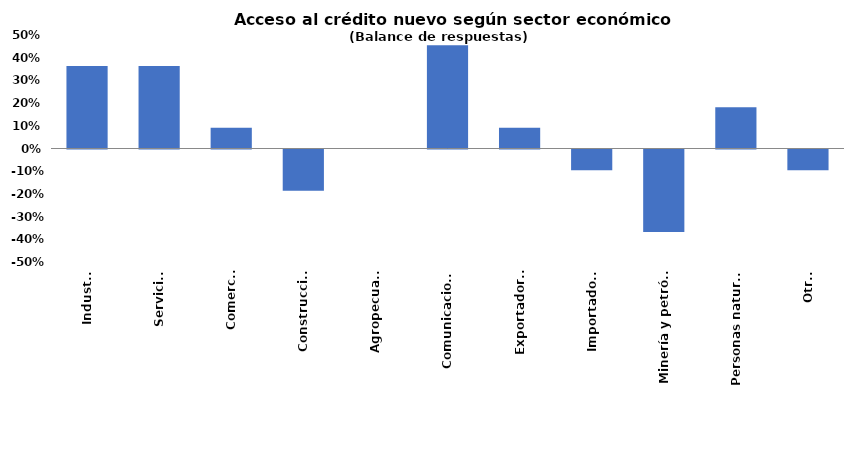
| Category | Series 0 |
|---|---|
| Industria | 0.364 |
| Servicios | 0.364 |
| Comercio | 0.091 |
| Construcción | -0.182 |
| Agropecuario | 0 |
| Comunicaciones | 0.455 |
| Exportadores | 0.091 |
| Importadores | -0.091 |
| Minería y petróleo | -0.364 |
| Personas naturales | 0.182 |
| Otro. | -0.091 |